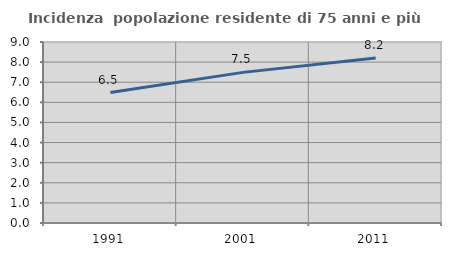
| Category | Incidenza  popolazione residente di 75 anni e più |
|---|---|
| 1991.0 | 6.484 |
| 2001.0 | 7.489 |
| 2011.0 | 8.209 |